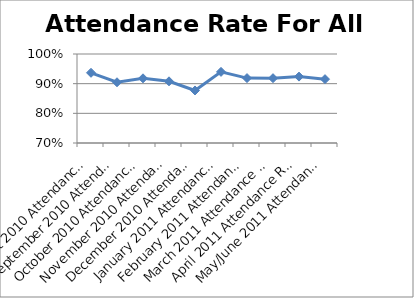
| Category | Attendance Rate For All Students |
|---|---|
| August 2010 Attendance Rate | 0.937 |
| September 2010 Attendance Rate | 0.905 |
| October 2010 Attendance Rate | 0.918 |
| November 2010 Attendance Rate | 0.908 |
| December 2010 Attendance Rate | 0.877 |
| January 2011 Attendance Rate | 0.94 |
| February 2011 Attendance Rate | 0.919 |
| March 2011 Attendance Rate | 0.918 |
| April 2011 Attendance Rate | 0.924 |
| May/June 2011 Attendance Rate | 0.915 |